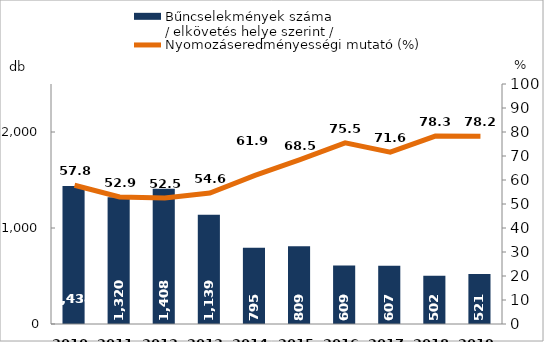
| Category | Bűncselekmények száma
/ elkövetés helye szerint / |
|---|---|
| 2010. év | 1438 |
| 2011. év | 1320 |
| 2012. év | 1408 |
| 2013. év | 1139 |
| 2014. év | 795 |
| 2015. év | 809 |
| 2016. év | 609 |
| 2017. év | 607 |
| 2018. év | 502 |
| 2019. év | 521 |